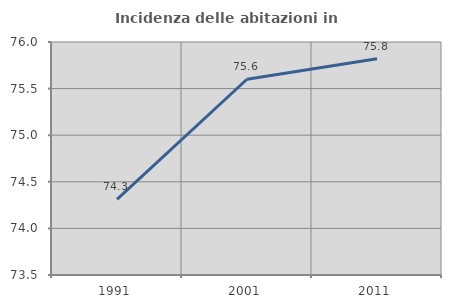
| Category | Incidenza delle abitazioni in proprietà  |
|---|---|
| 1991.0 | 74.311 |
| 2001.0 | 75.6 |
| 2011.0 | 75.819 |